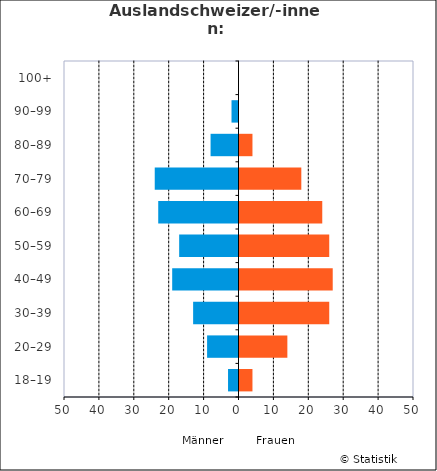
| Category | Männer | Frauen |
|---|---|---|
| 18–19 | -3 | 4 |
| 20–29 | -9 | 14 |
| 30–39 | -13 | 26 |
| 40–49 | -19 | 27 |
| 50–59 | -17 | 26 |
| 60–69 | -23 | 24 |
| 70–79 | -24 | 18 |
| 80–89 | -8 | 4 |
| 90–99 | -2 | 0 |
| 100+ | 0 | 0 |